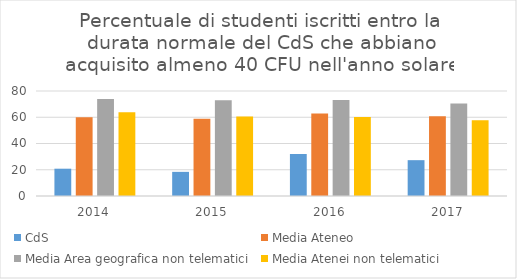
| Category | CdS | Media Ateneo | Media Area geografica non telematici | Media Atenei non telematici |
|---|---|---|---|---|
| 2014.0 | 20.8 | 60 | 73.9 | 63.8 |
| 2015.0 | 18.4 | 58.9 | 72.9 | 60.5 |
| 2016.0 | 32 | 62.9 | 73.1 | 60.1 |
| 2017.0 | 27.3 | 60.8 | 70.5 | 57.8 |